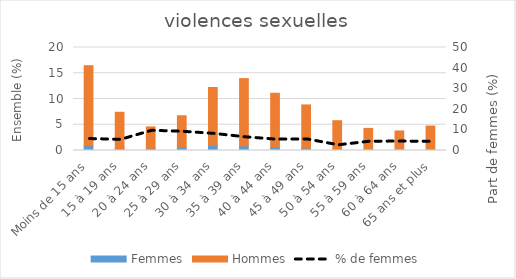
| Category | Femmes | Hommes |
|---|---|---|
| Moins de 15 ans | 0.915 | 15.549 |
| 15 à 19 ans | 0.384 | 7.038 |
| 20 à 24 ans | 0.439 | 4.146 |
| 25 à 29 ans | 0.613 | 6.132 |
| 30 à 34 ans | 0.988 | 11.247 |
| 35 à 39 ans | 0.897 | 13.059 |
| 40 à 44 ans | 0.586 | 10.534 |
| 45 à 49 ans | 0.476 | 8.374 |
| 50 à 54 ans | 0.146 | 5.637 |
| 55 à 59 ans | 0.183 | 4.109 |
| 60 à 64 ans | 0.165 | 3.633 |
| 65 ans et plus | 0.201 | 4.548 |